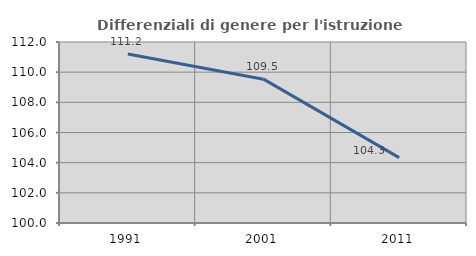
| Category | Differenziali di genere per l'istruzione superiore |
|---|---|
| 1991.0 | 111.209 |
| 2001.0 | 109.536 |
| 2011.0 | 104.336 |